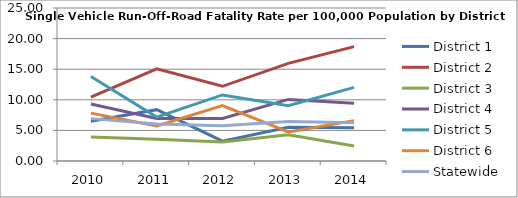
| Category | District 1 | District 2 | District 3 | District 4 | District 5 | District 6 | Statewide |
|---|---|---|---|---|---|---|---|
| 2010.0 | 6.505 | 10.436 | 3.937 | 9.322 | 13.81 | 7.824 | 6.924 |
| 2011.0 | 8.387 | 15.064 | 3.569 | 6.951 | 7.172 | 5.733 | 6.057 |
| 2012.0 | 3.249 | 12.206 | 3.097 | 6.946 | 10.795 | 9.068 | 5.765 |
| 2013.0 | 5.516 | 15.949 | 4.291 | 10.06 | 9.029 | 4.749 | 6.451 |
| 2014.0 | 5.42 | 18.686 | 2.442 | 9.449 | 12.031 | 6.596 | 6.241 |